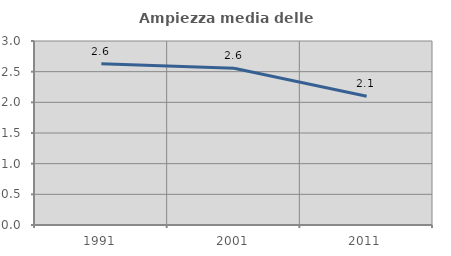
| Category | Ampiezza media delle famiglie |
|---|---|
| 1991.0 | 2.629 |
| 2001.0 | 2.557 |
| 2011.0 | 2.099 |